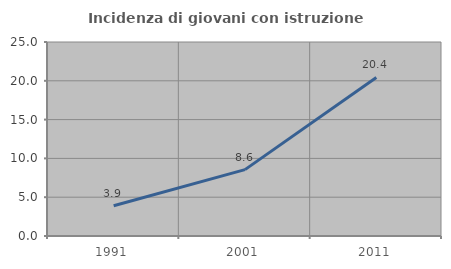
| Category | Incidenza di giovani con istruzione universitaria |
|---|---|
| 1991.0 | 3.891 |
| 2001.0 | 8.553 |
| 2011.0 | 20.435 |